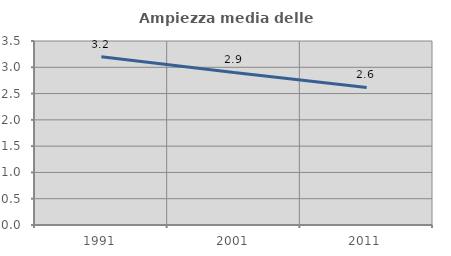
| Category | Ampiezza media delle famiglie |
|---|---|
| 1991.0 | 3.201 |
| 2001.0 | 2.902 |
| 2011.0 | 2.616 |